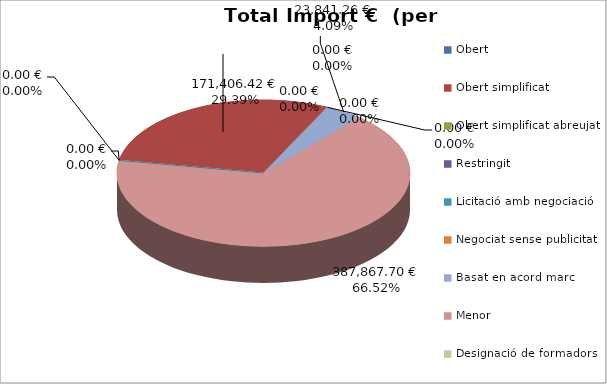
| Category | Total preu              (amb iva) |
|---|---|
| Obert | 0 |
| Obert simplificat | 171406.422 |
| Obert simplificat abreujat | 0 |
| Restringit | 0 |
| Licitació amb negociació | 0 |
| Negociat sense publicitat | 0 |
| Basat en acord marc | 23841.26 |
| Menor | 387867.7 |
| Designació de formadors | 0 |